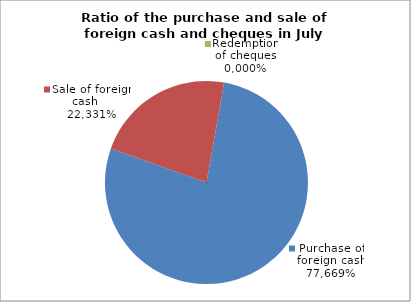
| Category | Purchase of foreign cash |
|---|---|
| 0 | 0.777 |
| 1 | 0.223 |
| 2 | 0 |